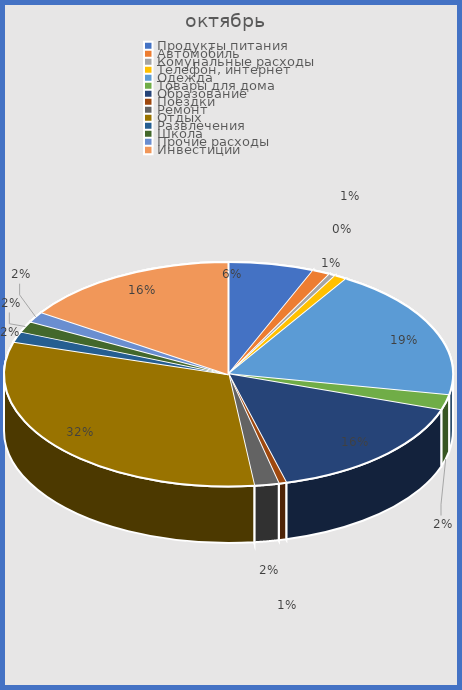
| Category | Series 0 |
|---|---|
| Продукты питания | 0.062 |
| Автомобиль | 0.013 |
| Комунальные расходы | 0.005 |
| Телефон, интернет | 0.009 |
| Одежда | 0.192 |
| Товары для дома | 0.022 |
| Образование | 0.157 |
| Поездки | 0.005 |
| Ремонт | 0.018 |
| Отдых | 0.315 |
| Развлечения | 0.015 |
| Школа | 0.016 |
| Прочие расходы | 0.015 |
| Инвестиции | 0.157 |